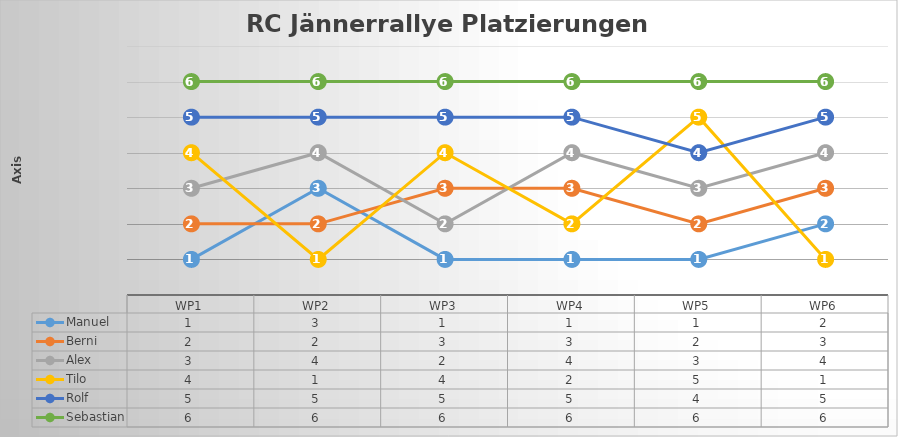
| Category | Manuel | Berni | Alex | Tilo | Rolf | Sebastian |
|---|---|---|---|---|---|---|
| WP1 | 1 | 2 | 3 | 4 | 5 | 6 |
| WP2 | 3 | 2 | 4 | 1 | 5 | 6 |
| WP3 | 1 | 3 | 2 | 4 | 5 | 6 |
| WP4 | 1 | 3 | 4 | 2 | 5 | 6 |
| WP5 | 1 | 2 | 3 | 5 | 4 | 6 |
| WP6 | 2 | 3 | 4 | 1 | 5 | 6 |